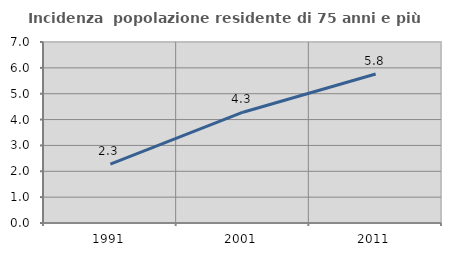
| Category | Incidenza  popolazione residente di 75 anni e più |
|---|---|
| 1991.0 | 2.279 |
| 2001.0 | 4.286 |
| 2011.0 | 5.762 |